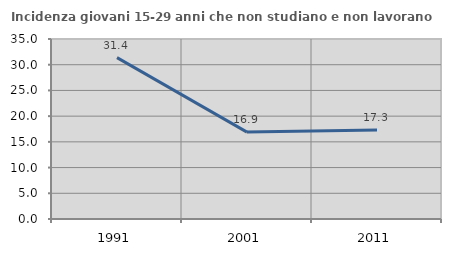
| Category | Incidenza giovani 15-29 anni che non studiano e non lavorano  |
|---|---|
| 1991.0 | 31.373 |
| 2001.0 | 16.901 |
| 2011.0 | 17.302 |